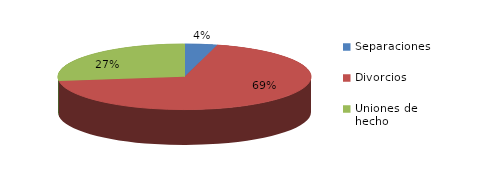
| Category | Series 0 |
|---|---|
| Separaciones | 53 |
| Divorcios | 876 |
| Uniones de hecho | 344 |